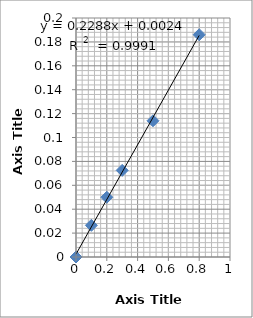
| Category | Average - blank |
|---|---|
| 0.8 | 0.186 |
| 0.5 | 0.114 |
| 0.3 | 0.073 |
| 0.2 | 0.05 |
| 0.1 | 0.026 |
| 0.0 | 0 |